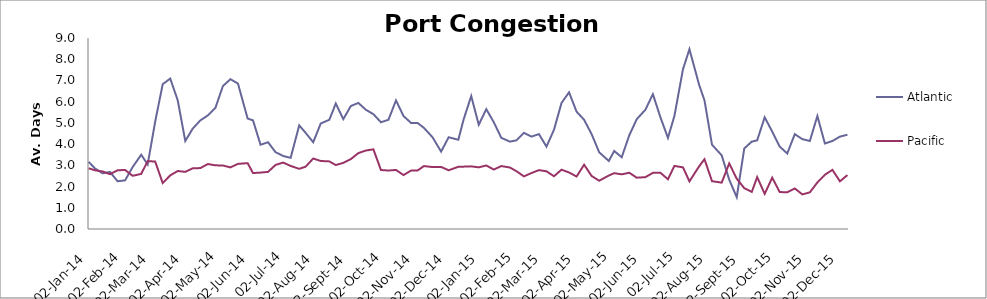
| Category | Atlantic  | Pacific |
|---|---|---|
| 2014-01-02 | 3.167 | 2.863 |
| 2014-01-08 | 2.854 | 2.767 |
| 2014-01-15 | 2.625 | 2.712 |
| 2014-01-22 | 2.688 | 2.582 |
| 2014-01-29 | 2.25 | 2.767 |
| 2014-02-05 | 2.292 | 2.781 |
| 2014-02-12 | 2.917 | 2.507 |
| 2014-02-20 | 3.5 | 2.596 |
| 2014-02-26 | 3.042 | 3.199 |
| 2014-03-05 | 5.059 | 3.178 |
| 2014-03-12 | 6.824 | 2.164 |
| 2014-03-19 | 7.088 | 2.527 |
| 2014-03-26 | 6.059 | 2.733 |
| 2014-04-02 | 4.147 | 2.692 |
| 2014-04-09 | 4.735 | 2.863 |
| 2014-04-16 | 5.118 | 2.87 |
| 2014-04-23 | 5.353 | 3.062 |
| 2014-04-30 | 5.706 | 3 |
| 2014-05-07 | 6.735 | 2.993 |
| 2014-05-14 | 7.059 | 2.904 |
| 2014-05-21 | 6.853 | 3.068 |
| 2014-05-30 | 5.206 | 3.103 |
| 2014-06-04 | 5.118 | 2.637 |
| 2014-06-11 | 3.971 | 2.658 |
| 2014-06-18 | 4.088 | 2.692 |
| 2014-06-25 | 3.618 | 3.021 |
| 2014-07-02 | 3.441 | 3.13 |
| 2014-07-09 | 3.353 | 2.973 |
| 2014-07-17 | 4.882 | 2.836 |
| 2014-07-23 | 4.529 | 2.938 |
| 2014-07-30 | 4.088 | 3.322 |
| 2014-08-06 | 4.971 | 3.205 |
| 2014-08-14 | 5.147 | 3.185 |
| 2014-08-20 | 5.912 | 3.014 |
| 2014-08-27 | 5.176 | 3.116 |
| 2014-09-03 | 5.794 | 3.295 |
| 2014-09-10 | 5.941 | 3.575 |
| 2014-09-17 | 5.618 | 3.699 |
| 2014-09-24 | 5.412 | 3.753 |
| 2014-10-01 | 5.029 | 2.781 |
| 2014-10-08 | 5.147 | 2.753 |
| 2014-10-15 | 6.059 | 2.785 |
| 2014-10-22 | 5.324 | 2.541 |
| 2014-10-29 | 5 | 2.753 |
| 2014-11-04 | 5 | 2.753 |
| 2014-11-10 | 4.765 | 2.966 |
| 2014-11-18 | 4.324 | 2.918 |
| 2014-11-26 | 3.647 | 2.925 |
| 2014-12-03 | 4.324 | 2.767 |
| 2014-12-12 | 4.206 | 2.932 |
| 2014-12-17 | 5.176 | 2.938 |
| 2014-12-24 | 6.265 | 2.952 |
| 2014-12-31 | 4.912 | 2.904 |
| 2015-01-07 | 5.647 | 2.993 |
| 2015-01-14 | 5.029 | 2.801 |
| 2015-01-21 | 4.294 | 2.966 |
| 2015-01-29 | 4.118 | 2.897 |
| 2015-02-04 | 4.176 | 2.726 |
| 2015-02-11 | 4.529 | 2.479 |
| 2015-02-18 | 4.353 | 2.637 |
| 2015-02-25 | 4.471 | 2.774 |
| 2015-03-04 | 3.882 | 2.719 |
| 2015-03-11 | 4.676 | 2.486 |
| 2015-03-18 | 5.941 | 2.795 |
| 2015-03-25 | 6.441 | 2.664 |
| 2015-04-01 | 5.529 | 2.473 |
| 2015-04-08 | 5.147 | 3.027 |
| 2015-04-15 | 4.471 | 2.5 |
| 2015-04-22 | 3.618 | 2.274 |
| 2015-05-01 | 3.206 | 2.521 |
| 2015-05-06 | 3.676 | 2.63 |
| 2015-05-13 | 3.382 | 2.575 |
| 2015-05-20 | 4.412 | 2.651 |
| 2015-05-27 | 5.176 | 2.418 |
| 2015-06-04 | 5.618 | 2.442 |
| 2015-06-11 | 6.353 | 2.645 |
| 2015-06-18 | 5.265 | 2.651 |
| 2015-06-25 | 4.294 | 2.342 |
| 2015-07-01 | 5.324 | 2.973 |
| 2015-07-09 | 7.529 | 2.904 |
| 2015-07-15 | 8.471 | 2.244 |
| 2015-07-24 | 6.794 | 2.952 |
| 2015-07-29 | 6.059 | 3.288 |
| 2015-08-05 | 3.971 | 2.253 |
| 2015-08-14 | 3.471 | 2.185 |
| 2015-08-21 | 2.324 | 3.089 |
| 2015-08-28 | 1.5 | 2.37 |
| 2015-09-04 | 3.794 | 1.925 |
| 2015-09-11 | 4.118 | 1.747 |
| 2015-09-16 | 4.176 | 2.445 |
| 2015-09-23 | 5.265 | 1.658 |
| 2015-09-30 | 4.588 | 2.418 |
| 2015-10-07 | 3.882 | 1.74 |
| 2015-10-14 | 3.559 | 1.733 |
| 2015-10-21 | 4.471 | 1.911 |
| 2015-10-28 | 4.235 | 1.63 |
| 2015-11-04 | 4.147 | 1.726 |
| 2015-11-11 | 5.324 | 2.192 |
| 2015-11-18 | 4.029 | 2.555 |
| 2015-11-25 | 4.147 | 2.788 |
| 2015-12-02 | 4.353 | 2.247 |
| 2015-12-09 | 4.441 | 2.541 |